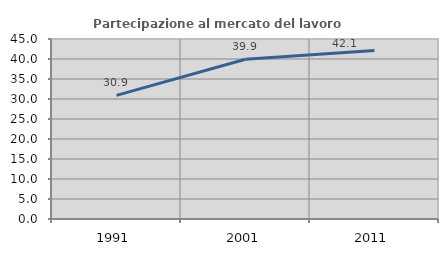
| Category | Partecipazione al mercato del lavoro  femminile |
|---|---|
| 1991.0 | 30.911 |
| 2001.0 | 39.923 |
| 2011.0 | 42.14 |